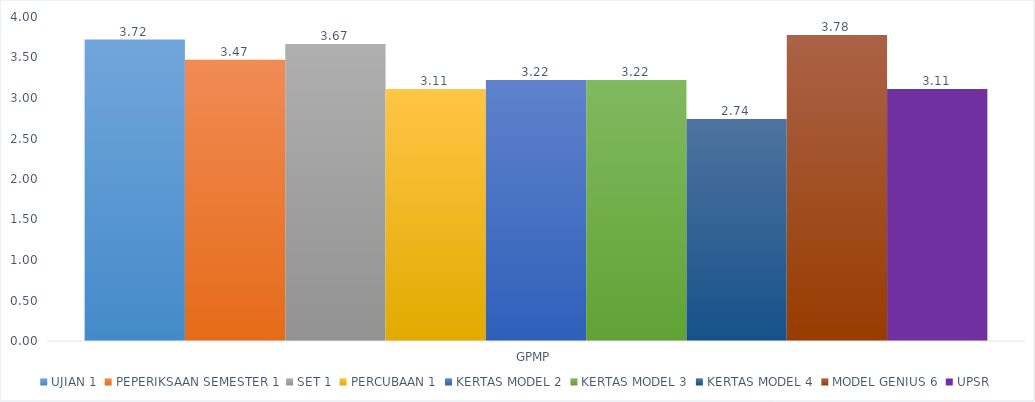
| Category | UJIAN 1 | PEPERIKSAAN SEMESTER 1 | SET 1 | PERCUBAAN 1 | KERTAS MODEL 2 | KERTAS MODEL 3 | KERTAS MODEL 4 | MODEL GENIUS 6 | UPSR |
|---|---|---|---|---|---|---|---|---|---|
| GPMP | 3.722 | 3.472 | 3.667 | 3.111 | 3.222 | 3.222 | 2.742 | 3.778 | 3.111 |